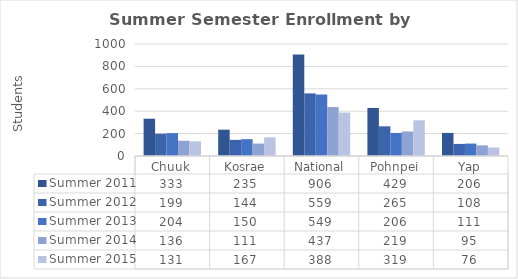
| Category | Summer 2011 | Summer 2012 | Summer 2013 | Summer 2014 | Summer 2015 |
|---|---|---|---|---|---|
| Chuuk | 333 | 199 | 204 | 136 | 131 |
| Kosrae | 235 | 144 | 150 | 111 | 167 |
| National | 906 | 559 | 549 | 437 | 388 |
| Pohnpei | 429 | 265 | 206 | 219 | 319 |
| Yap | 206 | 108 | 111 | 95 | 76 |